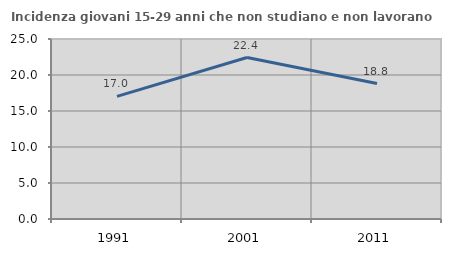
| Category | Incidenza giovani 15-29 anni che non studiano e non lavorano  |
|---|---|
| 1991.0 | 17.028 |
| 2001.0 | 22.43 |
| 2011.0 | 18.812 |